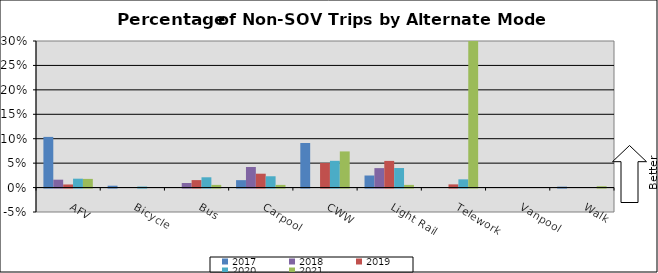
| Category | 2017 | 2018 | 2019 | 2020 | 2021 |
|---|---|---|---|---|---|
| AFV | 0.104 | 0.016 | 0.006 | 0.018 | 0.018 |
| Bicycle | 0.004 | 0 | 0 | 0.002 | 0 |
| Bus | 0 | 0.009 | 0.015 | 0.021 | 0.005 |
| Carpool | 0.015 | 0.042 | 0.028 | 0.023 | 0.005 |
| CWW | 0.091 | 0 | 0.05 | 0.055 | 0.074 |
| Light Rail | 0.025 | 0.04 | 0.055 | 0.04 | 0.005 |
| Telework | 0 | 0 | 0.007 | 0.017 | 0.326 |
| Vanpool | 0 | 0 | 0 | 0 | 0 |
| Walk | 0.002 | 0 | 0 | 0 | 0.003 |